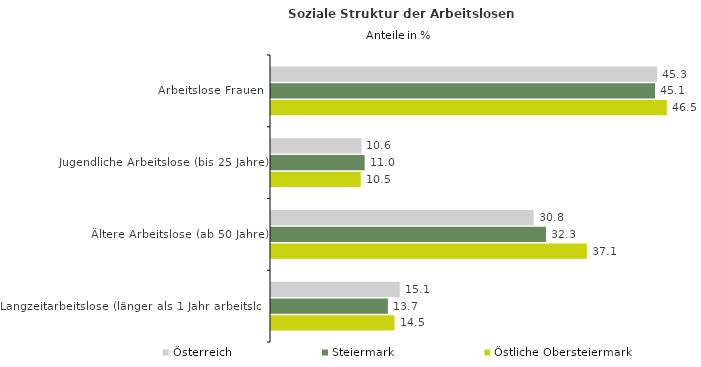
| Category | Österreich | Steiermark | Östliche Obersteiermark |
|---|---|---|---|
| Arbeitslose Frauen | 45.325 | 45.075 | 46.462 |
| Jugendliche Arbeitslose (bis 25 Jahre) | 10.608 | 10.993 | 10.527 |
| Ältere Arbeitslose (ab 50 Jahre) | 30.822 | 32.281 | 37.079 |
| Langzeitarbeitslose (länger als 1 Jahr arbeitslos) | 15.122 | 13.717 | 14.499 |